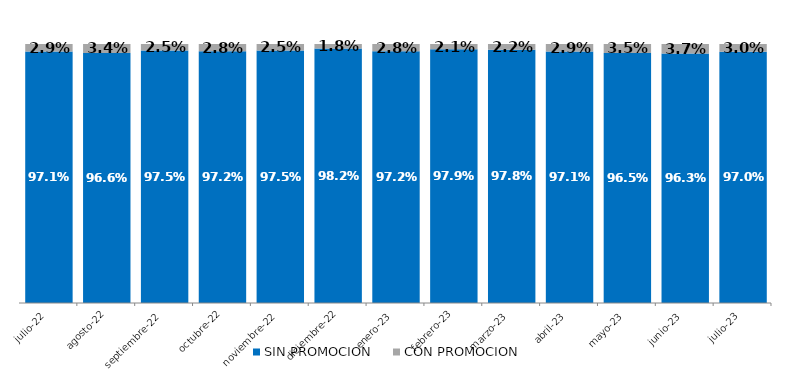
| Category | SIN PROMOCION   | CON PROMOCION   |
|---|---|---|
| 2022-07-01 | 0.971 | 0.029 |
| 2022-08-01 | 0.966 | 0.034 |
| 2022-09-01 | 0.975 | 0.025 |
| 2022-10-01 | 0.972 | 0.028 |
| 2022-11-01 | 0.975 | 0.025 |
| 2022-12-01 | 0.982 | 0.018 |
| 2023-01-01 | 0.972 | 0.028 |
| 2023-02-01 | 0.979 | 0.021 |
| 2023-03-01 | 0.978 | 0.022 |
| 2023-04-01 | 0.971 | 0.029 |
| 2023-05-01 | 0.965 | 0.035 |
| 2023-06-01 | 0.963 | 0.037 |
| 2023-07-01 | 0.97 | 0.03 |